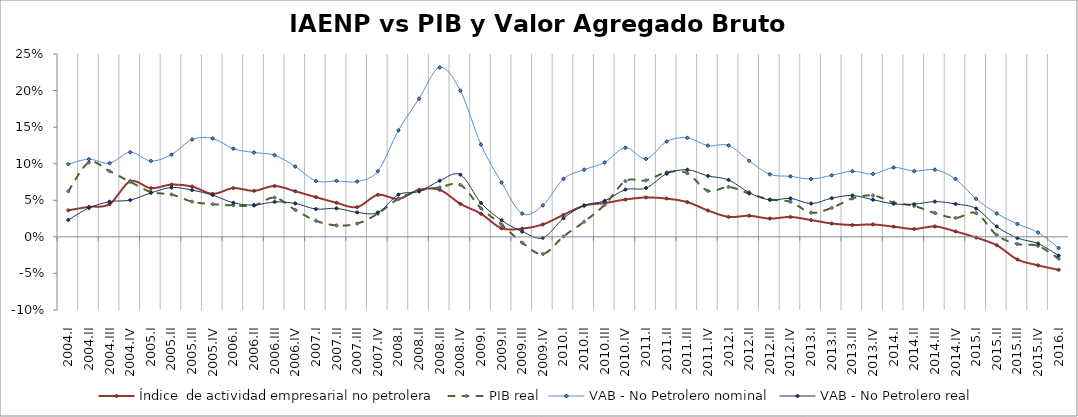
| Category | Índice  de actividad empresarial no petrolera | PIB real | VAB - No Petrolero nominal | VAB - No Petrolero real |
|---|---|---|---|---|
| 2004.I | 0.036 | 0.062 | 0.099 | 0.023 |
| 2004.II | 0.041 | 0.102 | 0.106 | 0.039 |
| 2004.III | 0.045 | 0.09 | 0.101 | 0.048 |
| 2004.IV | 0.076 | 0.075 | 0.116 | 0.05 |
| 2005.I | 0.066 | 0.061 | 0.104 | 0.06 |
| 2005.II | 0.071 | 0.058 | 0.112 | 0.067 |
| 2005.III | 0.069 | 0.048 | 0.133 | 0.064 |
| 2005.IV | 0.059 | 0.045 | 0.134 | 0.057 |
| 2006.I | 0.067 | 0.043 | 0.121 | 0.047 |
| 2006.II | 0.063 | 0.043 | 0.115 | 0.044 |
| 2006.III | 0.07 | 0.054 | 0.112 | 0.048 |
| 2006.IV | 0.062 | 0.037 | 0.096 | 0.046 |
| 2007.I | 0.054 | 0.022 | 0.076 | 0.038 |
| 2007.II | 0.047 | 0.016 | 0.076 | 0.039 |
| 2007.III | 0.041 | 0.018 | 0.076 | 0.033 |
| 2007.IV | 0.057 | 0.032 | 0.09 | 0.033 |
| 2008.I | 0.052 | 0.052 | 0.146 | 0.058 |
| 2008.II | 0.064 | 0.063 | 0.189 | 0.062 |
| 2008.III | 0.064 | 0.068 | 0.232 | 0.077 |
| 2008.IV | 0.045 | 0.071 | 0.2 | 0.085 |
| 2009.I | 0.032 | 0.039 | 0.126 | 0.046 |
| 2009.II | 0.012 | 0.017 | 0.074 | 0.023 |
| 2009.III | 0.011 | -0.008 | 0.032 | 0.007 |
| 2009.IV | 0.017 | -0.023 | 0.043 | -0.001 |
| 2010.I | 0.03 | 0.001 | 0.079 | 0.025 |
| 2010.II | 0.043 | 0.021 | 0.092 | 0.043 |
| 2010.III | 0.046 | 0.044 | 0.102 | 0.049 |
| 2010.IV | 0.051 | 0.076 | 0.122 | 0.065 |
| 2011.I | 0.054 | 0.077 | 0.107 | 0.067 |
| 2011.II | 0.052 | 0.088 | 0.13 | 0.086 |
| 2011.III | 0.048 | 0.087 | 0.135 | 0.092 |
| 2011.IV | 0.036 | 0.063 | 0.125 | 0.083 |
| 2012.I | 0.027 | 0.068 | 0.125 | 0.078 |
| 2012.II | 0.029 | 0.059 | 0.104 | 0.06 |
| 2012.III | 0.025 | 0.051 | 0.085 | 0.05 |
| 2012.IV | 0.027 | 0.048 | 0.083 | 0.053 |
| 2013.I | 0.023 | 0.033 | 0.079 | 0.046 |
| 2013.II | 0.018 | 0.04 | 0.084 | 0.053 |
| 2013.III | 0.016 | 0.052 | 0.09 | 0.057 |
| 2013.IV | 0.017 | 0.057 | 0.086 | 0.051 |
| 2014.I | 0.014 | 0.047 | 0.095 | 0.045 |
| 2014.II | 0.011 | 0.042 | 0.09 | 0.045 |
| 2014.III | 0.014 | 0.033 | 0.092 | 0.048 |
| 2014.IV | 0.007 | 0.026 | 0.079 | 0.045 |
| 2015.I | -0.001 | 0.032 | 0.052 | 0.039 |
| 2015.II | -0.012 | 0.002 | 0.032 | 0.014 |
| 2015.III | -0.031 | -0.01 | 0.018 | -0.002 |
| 2015.IV | -0.039 | -0.012 | 0.006 | -0.009 |
| 2016.I | -0.045 | -0.03 | -0.015 | -0.026 |